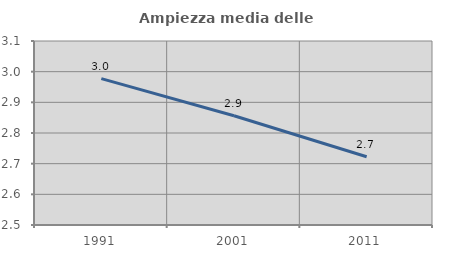
| Category | Ampiezza media delle famiglie |
|---|---|
| 1991.0 | 2.977 |
| 2001.0 | 2.856 |
| 2011.0 | 2.723 |